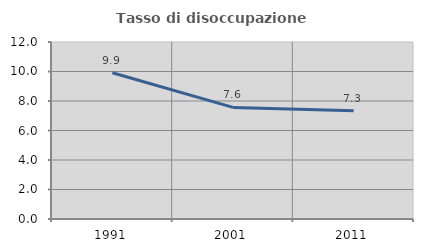
| Category | Tasso di disoccupazione giovanile  |
|---|---|
| 1991.0 | 9.916 |
| 2001.0 | 7.568 |
| 2011.0 | 7.333 |